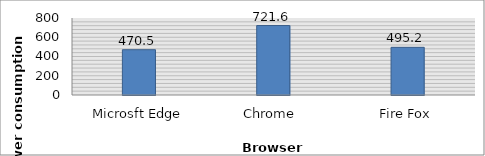
| Category | Series 0 |
|---|---|
| Microsft Edge | 470.5 |
| Chrome  | 721.6 |
| Fire Fox | 495.2 |